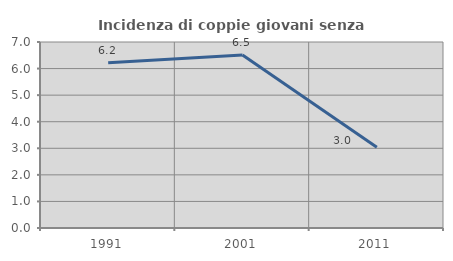
| Category | Incidenza di coppie giovani senza figli |
|---|---|
| 1991.0 | 6.216 |
| 2001.0 | 6.514 |
| 2011.0 | 3.041 |